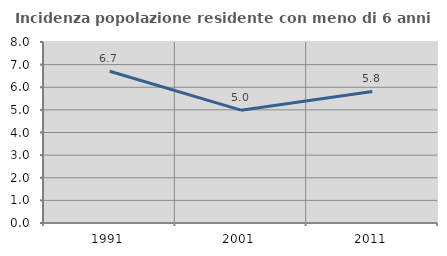
| Category | Incidenza popolazione residente con meno di 6 anni |
|---|---|
| 1991.0 | 6.71 |
| 2001.0 | 4.987 |
| 2011.0 | 5.814 |